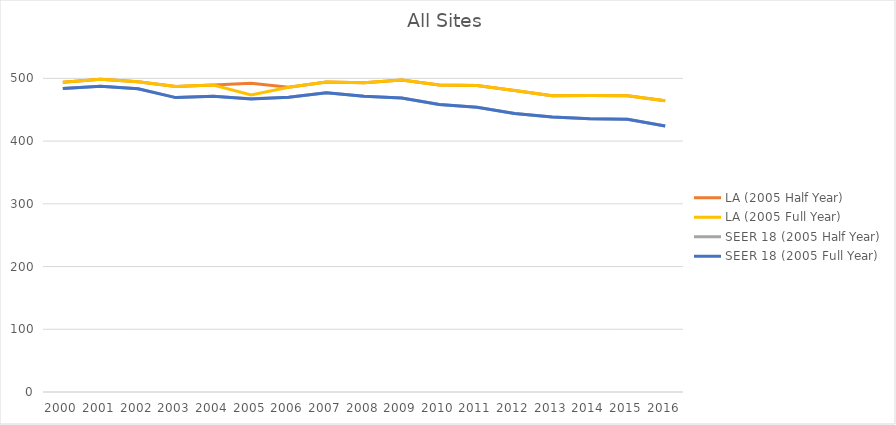
| Category | LA (2005 Half Year) | LA (2005 Full Year) | SEER 18 (2005 Half Year) | SEER 18 (2005 Full Year) |
|---|---|---|---|---|
| 2000.0 | 493.957 | 493.957 | 483.761 | 483.761 |
| 2001.0 | 498.778 | 498.778 | 487.476 | 487.476 |
| 2002.0 | 494.668 | 494.668 | 483.425 | 483.425 |
| 2003.0 | 487.159 | 487.159 | 469.353 | 469.353 |
| 2004.0 | 489.499 | 489.499 | 471.314 | 471.314 |
| 2005.0 | 492.238 | 473.619 | 467.408 | 467.067 |
| 2006.0 | 485.682 | 485.682 | 470.005 | 470.005 |
| 2007.0 | 494.368 | 494.368 | 476.888 | 476.888 |
| 2008.0 | 493.155 | 493.155 | 471.459 | 471.459 |
| 2009.0 | 497.453 | 497.453 | 468.808 | 468.808 |
| 2010.0 | 489.448 | 489.448 | 458.301 | 458.301 |
| 2011.0 | 488.794 | 488.794 | 453.939 | 453.939 |
| 2012.0 | 480.596 | 480.596 | 444.138 | 444.138 |
| 2013.0 | 472.364 | 472.364 | 438.257 | 438.257 |
| 2014.0 | 472.697 | 472.697 | 435.694 | 435.694 |
| 2015.0 | 472.098 | 472.098 | 434.625 | 434.625 |
| 2016.0 | 464.382 | 464.382 | 424.121 | 424.121 |